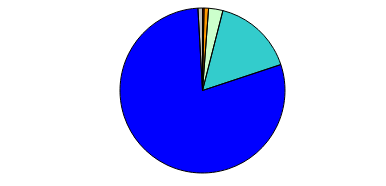
| Category | Series 0 |
|---|---|
| 0 | 2 |
| 1 | 6 |
| 2 | 19 |
| 3 | 108 |
| 4 | 537 |
| 5 | 6 |